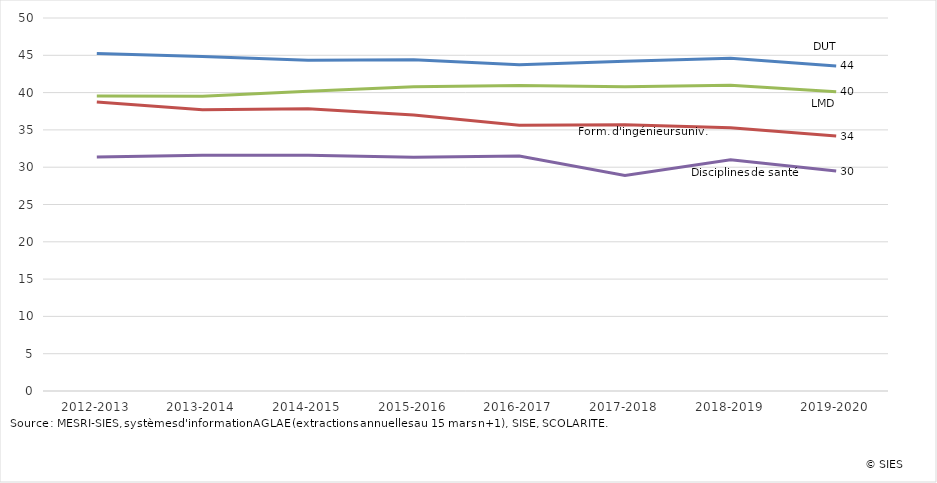
| Category | Préparations au DUT | Formations d'ingénieurs | Formations LMD disciplines générales (1)  | Disciplines de santé |
|---|---|---|---|---|
| 2012-2013 | 45.447 | 38.955 | 39.755 | 31.569 |
| 2013-2014 | 45.051 | 37.885 | 39.718 | 31.791 |
| 2014-2015 | 44.535 | 38.032 | 40.376 | 31.798 |
| 2015-2016 | 44.588 | 37.2 | 40.979 | 31.525 |
| 2016-2017 | 43.918 | 35.833 | 41.146 | 31.707 |
| 2017-2018 | 44.4 | 35.9 | 41 | 29.1 |
| 2018-2019 | 44.8 | 35.5 | 41.2 | 31.2 |
| 2019-2020 | 43.772 | 34.375 | 40.31 | 29.689 |